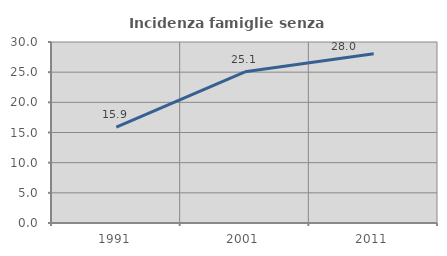
| Category | Incidenza famiglie senza nuclei |
|---|---|
| 1991.0 | 15.892 |
| 2001.0 | 25.056 |
| 2011.0 | 28.05 |